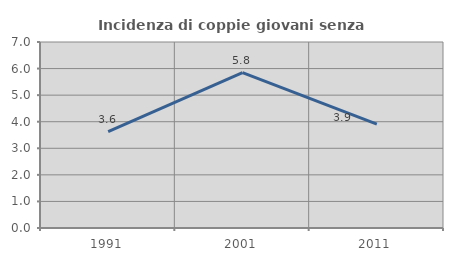
| Category | Incidenza di coppie giovani senza figli |
|---|---|
| 1991.0 | 3.623 |
| 2001.0 | 5.848 |
| 2011.0 | 3.911 |